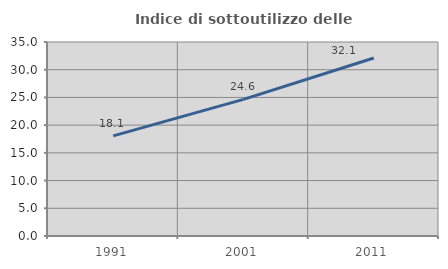
| Category | Indice di sottoutilizzo delle abitazioni  |
|---|---|
| 1991.0 | 18.071 |
| 2001.0 | 24.647 |
| 2011.0 | 32.116 |